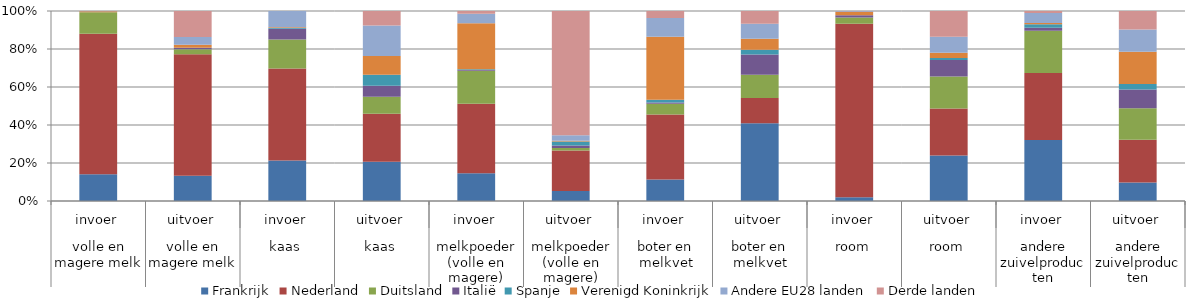
| Category | Frankrijk | Nederland | Duitsland | Italië | Spanje | Verenigd Koninkrijk | Andere EU28 landen | Derde landen |
|---|---|---|---|---|---|---|---|---|
| 0 | 38.886 | 204.605 | 31.394 | 0 | 0.061 | 1.362 | 0.339 | 0.033 |
| 1 | 23.453 | 112.351 | 4.588 | 1.212 | 0.181 | 2.676 | 7.3 | 23.958 |
| 2 | 160.825 | 366.439 | 115.346 | 43.059 | 2.63 | 3.304 | 64.09 | 0.142 |
| 3 | 110.215 | 134.551 | 47.72 | 30.739 | 31.306 | 52.2 | 85.637 | 40.985 |
| 4 | 41.224 | 103.059 | 48.958 | 1.307 | 1.123 | 68.102 | 14.152 | 3.994 |
| 5 | 18.138 | 74.304 | 4.756 | 4.527 | 7.336 | 1.15 | 10.094 | 227.672 |
| 6 | 50.024 | 150.697 | 25.203 | 3.01 | 5.901 | 146.61 | 43.26 | 16.366 |
| 7 | 122.021 | 39.825 | 36.294 | 31.916 | 7.277 | 17.338 | 23.707 | 19.825 |
| 8 | 5.73 | 259.736 | 9.631 | 3.157 | 0 | 4.957 | 1.22 | 0.325 |
| 9 | 69.173 | 71.655 | 48.855 | 25.061 | 3.283 | 7.734 | 24.641 | 39.037 |
| 10 | 151.171 | 166.268 | 105.352 | 6.986 | 8.803 | 3.515 | 24.604 | 4.914 |
| 11 | 111.327 | 255.711 | 189.42 | 112.017 | 33.735 | 193.192 | 133.835 | 110.696 |